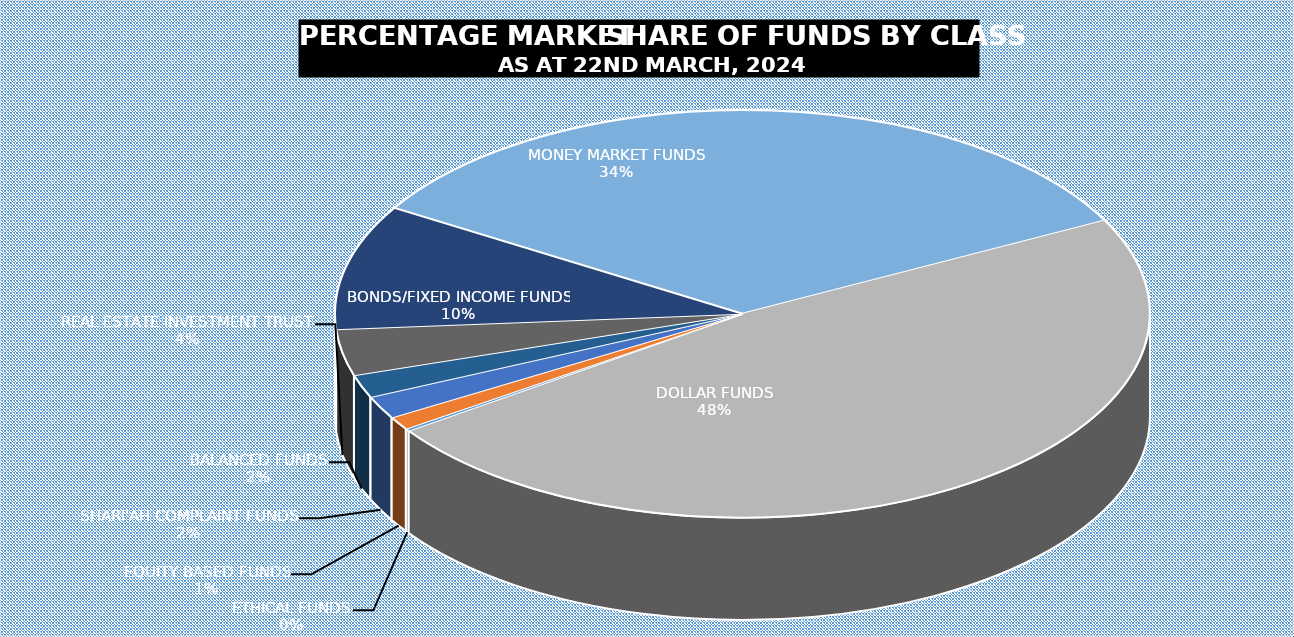
| Category | 22-Mar |
|---|---|
| ETHICAL FUNDS | 5194175729.48 |
| EQUITY BASED FUNDS | 28214914152.029 |
| SHARI'AH COMPLAINT FUNDS | 49029010570.446 |
| BALANCED FUNDS | 49695302922.374 |
| REAL ESTATE INVESTMENT TRUST | 99828191215.147 |
| BONDS/FIXED INCOME FUNDS | 270220925639.658 |
| MONEY MARKET FUNDS | 920023842595.846 |
| DOLLAR FUNDS | 1304383952109.419 |